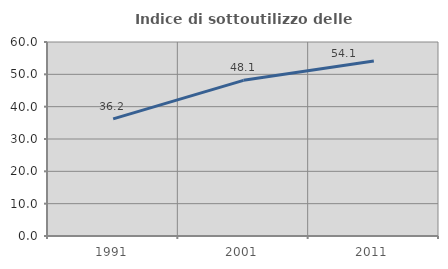
| Category | Indice di sottoutilizzo delle abitazioni  |
|---|---|
| 1991.0 | 36.232 |
| 2001.0 | 48.148 |
| 2011.0 | 54.135 |